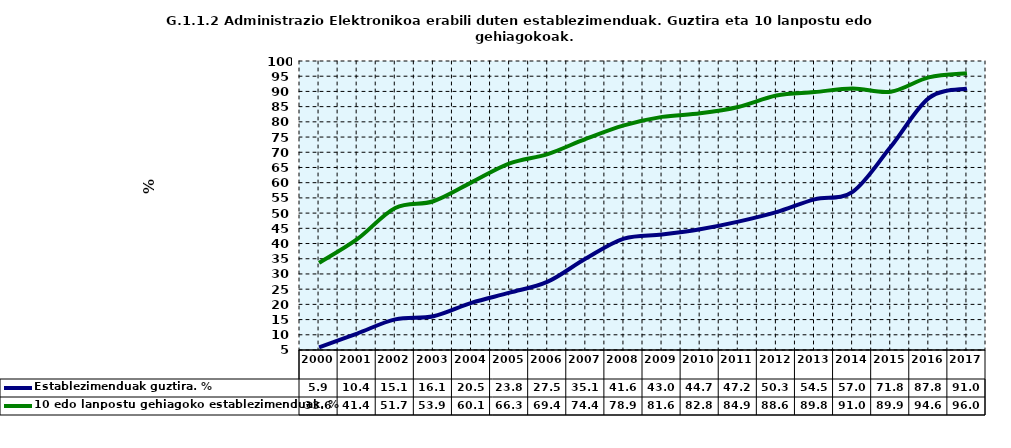
| Category | Establezimenduak guztira. % | 10 edo lanpostu gehiagoko establezimenduak. % |
|---|---|---|
| 2000.0 | 5.883 | 33.627 |
| 2001.0 | 10.421 | 41.411 |
| 2002.0 | 15.068 | 51.694 |
| 2003.0 | 16.098 | 53.904 |
| 2004.0 | 20.515 | 60.107 |
| 2005.0 | 23.837 | 66.349 |
| 2006.0 | 27.46 | 69.402 |
| 2007.0 | 35.078 | 74.42 |
| 2008.0 | 41.612 | 78.862 |
| 2009.0 | 42.972 | 81.627 |
| 2010.0 | 44.715 | 82.794 |
| 2011.0 | 47.2 | 84.9 |
| 2012.0 | 50.321 | 88.639 |
| 2013.0 | 54.524 | 89.774 |
| 2014.0 | 56.986 | 90.972 |
| 2015.0 | 71.8 | 89.9 |
| 2016.0 | 87.813 | 94.63 |
| 2017.0 | 90.959 | 95.964 |